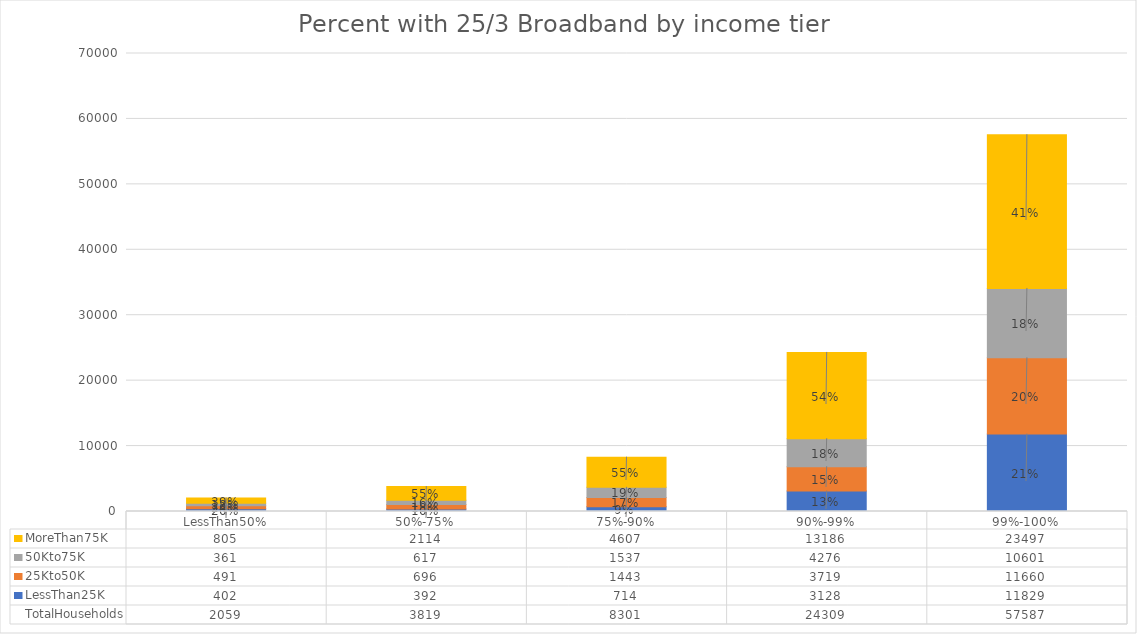
| Category | LessThan25K | 25Kto50K | 50Kto75K | MoreThan75K |
|---|---|---|---|---|
| LessThan50% | 402 | 491 | 361 | 805 |
| 50%-75% | 392 | 696 | 617 | 2114 |
| 75%-90% | 714 | 1443 | 1537 | 4607 |
| 90%-99% | 3128 | 3719 | 4276 | 13186 |
| 99%-100% | 11829 | 11660 | 10601 | 23497 |